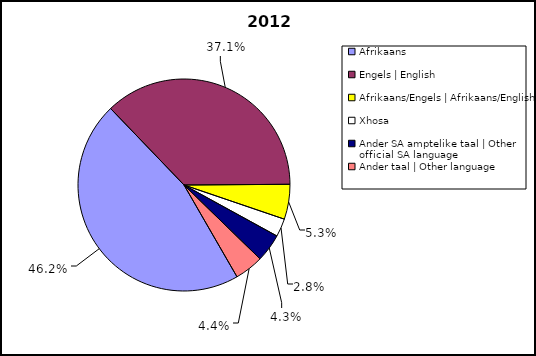
| Category | Series 0 |
|---|---|
| Afrikaans | 12843 |
| Engels | English | 10313 |
| Afrikaans/Engels | Afrikaans/English | 1483 |
| Xhosa | 769 |
| Ander SA amptelike taal | Other official SA language | 1191 |
| Ander taal | Other language | 1224 |